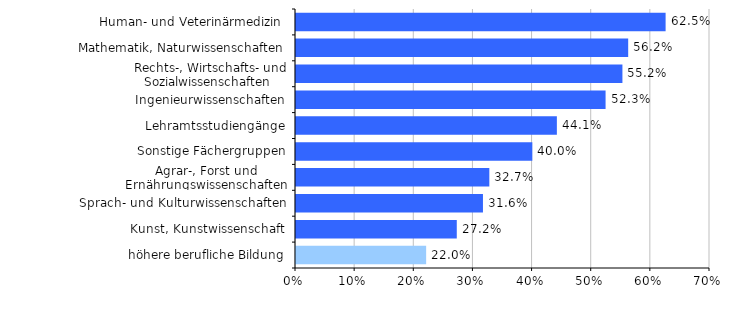
| Category | Series 0 |
|---|---|
| höhere berufliche Bildung | 0.22 |
| Kunst, Kunstwissenschaft | 0.272 |
| Sprach- und Kulturwissenschaften | 0.316 |
| Agrar-, Forst und Ernährungswissenschaften | 0.327 |
| Sonstige Fächergruppen | 0.4 |
| Lehramtsstudiengänge | 0.441 |
| Ingenieurwissenschaften | 0.523 |
| Rechts-, Wirtschafts- und Sozialwissenschaften  | 0.552 |
| Mathematik, Naturwissenschaften | 0.562 |
| Human- und Veterinärmedizin  | 0.625 |